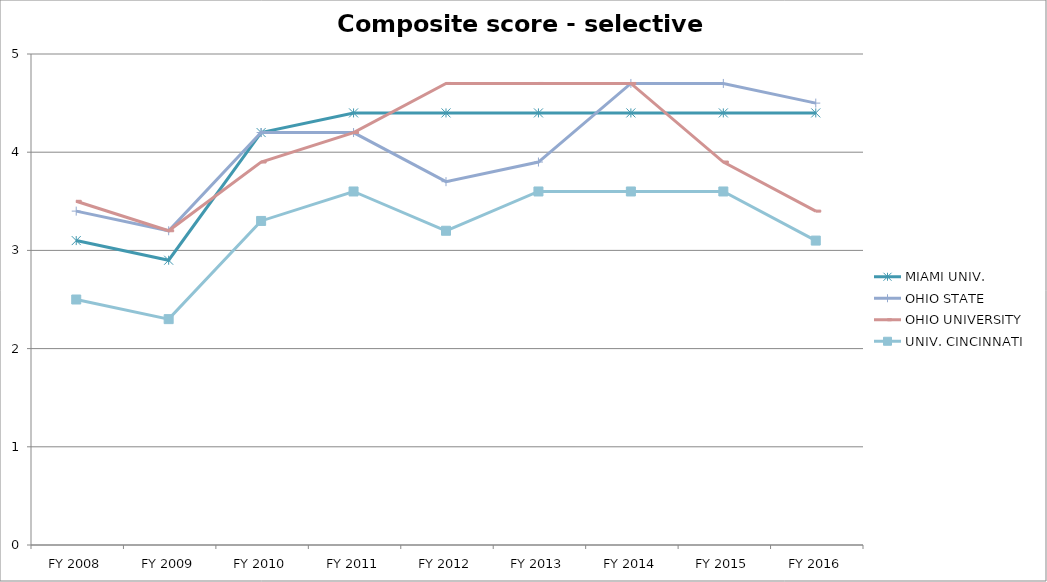
| Category | MIAMI UNIV.  | OHIO STATE  | OHIO UNIVERSITY  | UNIV. CINCINNATI  |
|---|---|---|---|---|
| FY 2016 | 4.4 | 4.5 | 3.4 | 3.1 |
| FY 2015 | 4.4 | 4.7 | 3.9 | 3.6 |
| FY 2014 | 4.4 | 4.7 | 4.7 | 3.6 |
| FY 2013 | 4.4 | 3.9 | 4.7 | 3.6 |
| FY 2012 | 4.4 | 3.7 | 4.7 | 3.2 |
| FY 2011 | 4.4 | 4.2 | 4.2 | 3.6 |
| FY 2010 | 4.2 | 4.2 | 3.9 | 3.3 |
| FY 2009 | 2.9 | 3.2 | 3.2 | 2.3 |
| FY 2008 | 3.1 | 3.4 | 3.5 | 2.5 |